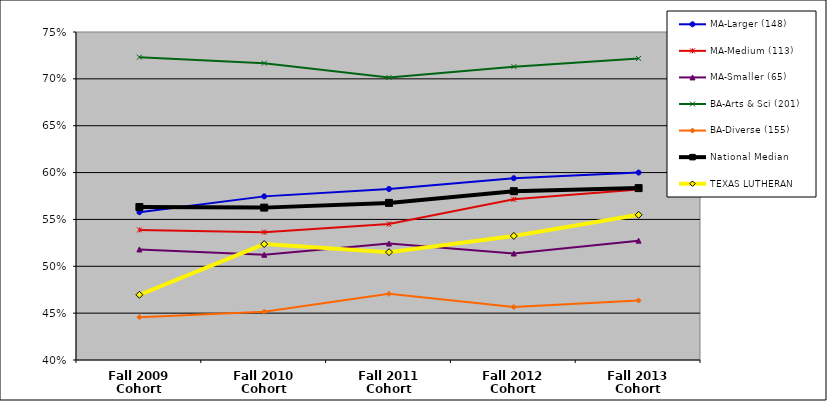
| Category | MA-Larger (148) | MA-Medium (113) | MA-Smaller (65) | BA-Arts & Sci (201) | BA-Diverse (155) | National Median | TEXAS LUTHERAN |
|---|---|---|---|---|---|---|---|
| Fall 2009 Cohort | 0.558 | 0.539 | 0.518 | 0.723 | 0.446 | 0.563 | 0.47 |
| Fall 2010 Cohort | 0.575 | 0.536 | 0.512 | 0.717 | 0.451 | 0.563 | 0.524 |
| Fall 2011 Cohort | 0.582 | 0.545 | 0.524 | 0.702 | 0.471 | 0.568 | 0.515 |
| Fall 2012 Cohort | 0.594 | 0.571 | 0.514 | 0.713 | 0.456 | 0.58 | 0.532 |
| Fall 2013 Cohort | 0.6 | 0.582 | 0.527 | 0.722 | 0.463 | 0.583 | 0.555 |